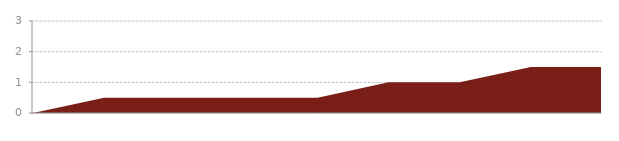
| Category | Series 0 |
|---|---|
| 0 | 0 |
| 1 | 0.5 |
| 2 | 0.5 |
| 3 | 0.5 |
| 4 | 0.5 |
| 5 | 1 |
| 6 | 1 |
| 7 | 1.5 |
| 8 | 1.5 |